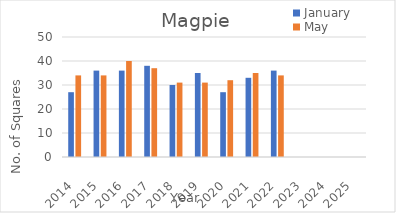
| Category | January | May |
|---|---|---|
| 2014.0 | 27 | 34 |
| 2015.0 | 36 | 34 |
| 2016.0 | 36 | 40 |
| 2017.0 | 38 | 37 |
| 2018.0 | 30 | 31 |
| 2019.0 | 35 | 31 |
| 2020.0 | 27 | 32 |
| 2021.0 | 33 | 35 |
| 2022.0 | 36 | 34 |
| 2023.0 | 0 | 0 |
| 2024.0 | 0 | 0 |
| 2025.0 | 0 | 0 |